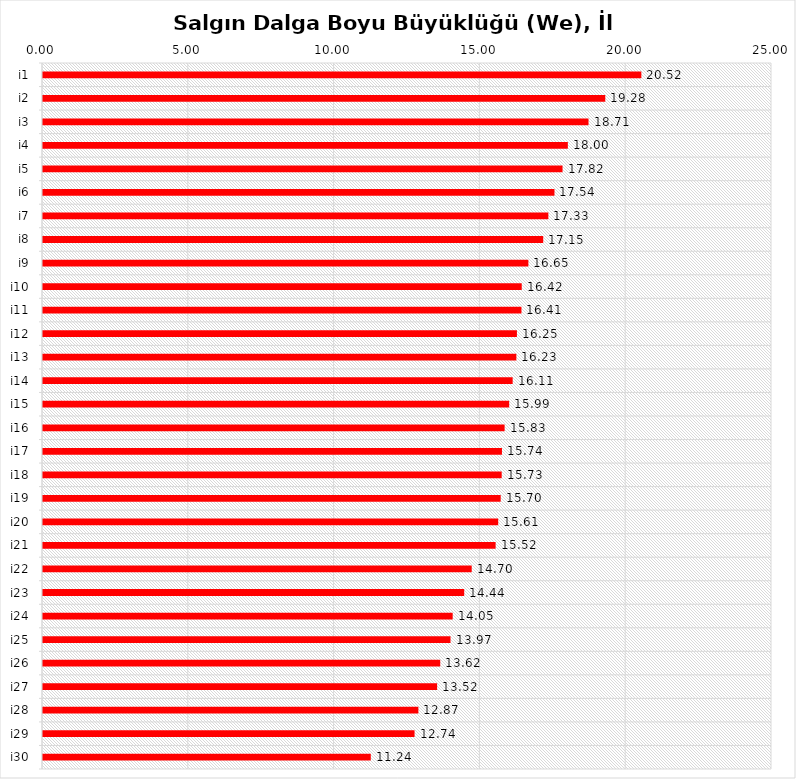
| Category | i5 |
|---|---|
| i1 | 20.519 |
| i2 | 19.282 |
| i3 | 18.708 |
| i4 | 17.999 |
| i5 | 17.817 |
| i6 | 17.54 |
| i7 | 17.33 |
| i8 | 17.154 |
| i9 | 16.645 |
| i10 | 16.417 |
| i11 | 16.408 |
| i12 | 16.252 |
| i13 | 16.233 |
| i14 | 16.107 |
| i15 | 15.987 |
| i16 | 15.83 |
| i17 | 15.739 |
| i18 | 15.73 |
| i19 | 15.696 |
| i20 | 15.61 |
| i21 | 15.522 |
| i22 | 14.702 |
| i23 | 14.445 |
| i24 | 14.05 |
| i25 | 13.975 |
| i26 | 13.623 |
| i27 | 13.516 |
| i28 | 12.873 |
| i29 | 12.742 |
| i30 | 11.241 |